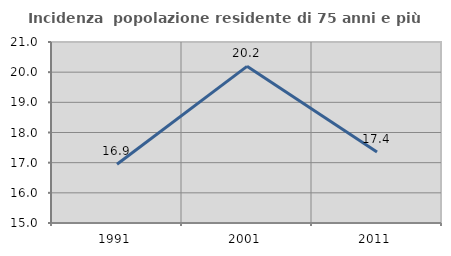
| Category | Incidenza  popolazione residente di 75 anni e più |
|---|---|
| 1991.0 | 16.949 |
| 2001.0 | 20.192 |
| 2011.0 | 17.355 |